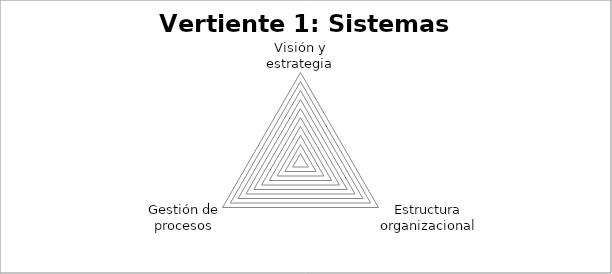
| Category | Series 0 |
|---|---|
| Visión y estrategia | 0 |
| Estructura organizacional | 0 |
| Gestión de procesos | 0 |